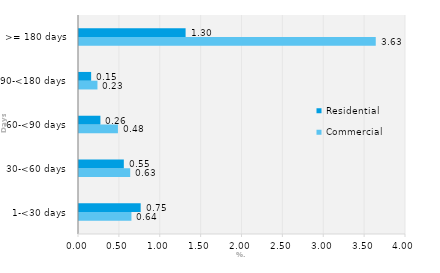
| Category | Commercial | Residential |
|---|---|---|
| 1-<30 days | 0.641 | 0.754 |
| 30-<60 days | 0.626 | 0.548 |
| 60-<90 days | 0.476 | 0.262 |
| 90-<180 days | 0.226 | 0.148 |
| >= 180 days | 3.63 | 1.304 |